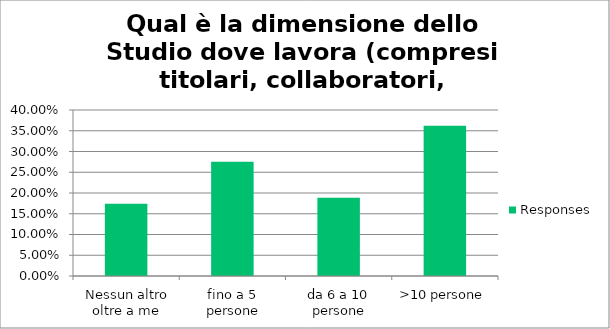
| Category | Responses |
|---|---|
| Nessun altro oltre a me | 0.174 |
| fino a 5 persone | 0.275 |
| da 6 a 10 persone | 0.188 |
| >10 persone | 0.362 |